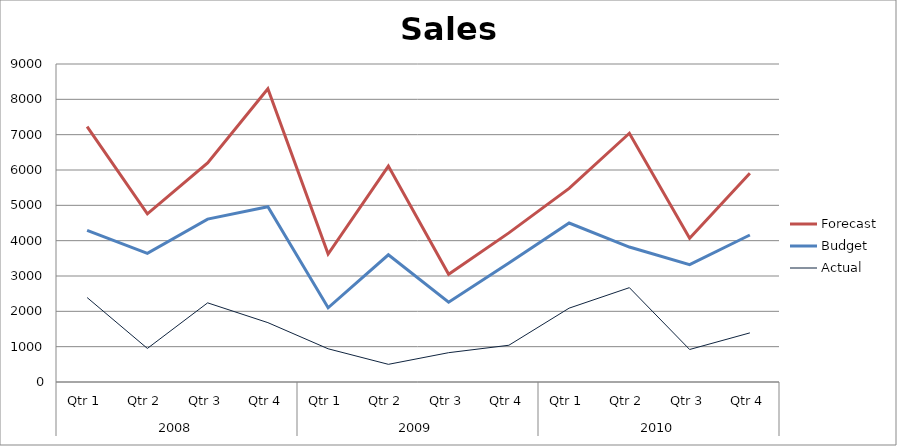
| Category | Actual | Budget | Forecast |
|---|---|---|---|
| 0 | 2390 | 1900 | 2940 |
| 1 | 950 | 2690 | 1120 |
| 2 | 2240 | 2370 | 1590 |
| 3 | 1680 | 3280 | 3340 |
| 4 | 940 | 1160 | 1520 |
| 5 | 500 | 3100 | 2510 |
| 6 | 830 | 1430 | 790 |
| 7 | 1040 | 2330 | 850 |
| 8 | 2090 | 2410 | 980 |
| 9 | 2670 | 1150 | 3220 |
| 10 | 920 | 2400 | 750 |
| 11 | 1390 | 2770 | 1750 |